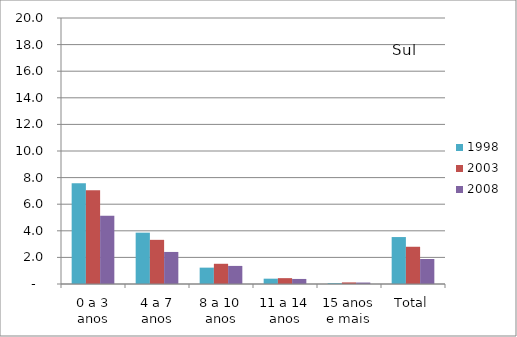
| Category | 1998 | 2003 | 2008 |
|---|---|---|---|
| 0 a 3 anos | 7.58 | 7.05 | 5.13 |
| 4 a 7 anos | 3.86 | 3.32 | 2.41 |
| 8 a 10 anos | 1.23 | 1.52 | 1.36 |
| 11 a 14 anos | 0.4 | 0.44 | 0.38 |
| 15 anos e mais | 0.06 | 0.12 | 0.11 |
| Total | 3.53 | 2.8 | 1.88 |